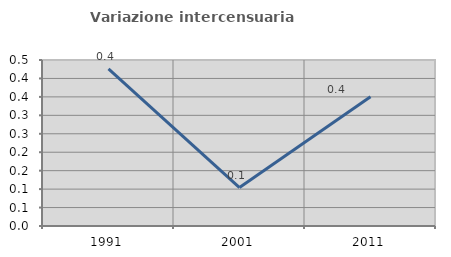
| Category | Variazione intercensuaria annua |
|---|---|
| 1991.0 | 0.426 |
| 2001.0 | 0.104 |
| 2011.0 | 0.35 |